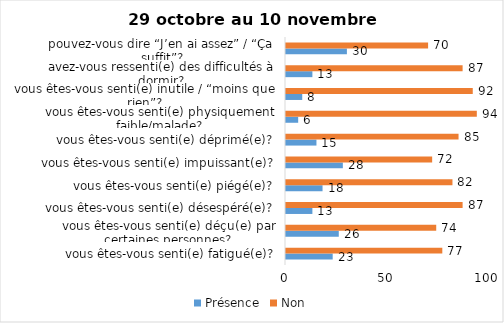
| Category | Présence | Non |
|---|---|---|
| vous êtes-vous senti(e) fatigué(e)? | 23 | 77 |
| vous êtes-vous senti(e) déçu(e) par certaines personnes? | 26 | 74 |
| vous êtes-vous senti(e) désespéré(e)? | 13 | 87 |
| vous êtes-vous senti(e) piégé(e)? | 18 | 82 |
| vous êtes-vous senti(e) impuissant(e)? | 28 | 72 |
| vous êtes-vous senti(e) déprimé(e)? | 15 | 85 |
| vous êtes-vous senti(e) physiquement faible/malade? | 6 | 94 |
| vous êtes-vous senti(e) inutile / “moins que rien”? | 8 | 92 |
| avez-vous ressenti(e) des difficultés à dormir? | 13 | 87 |
| pouvez-vous dire “J’en ai assez” / “Ça suffit”? | 30 | 70 |